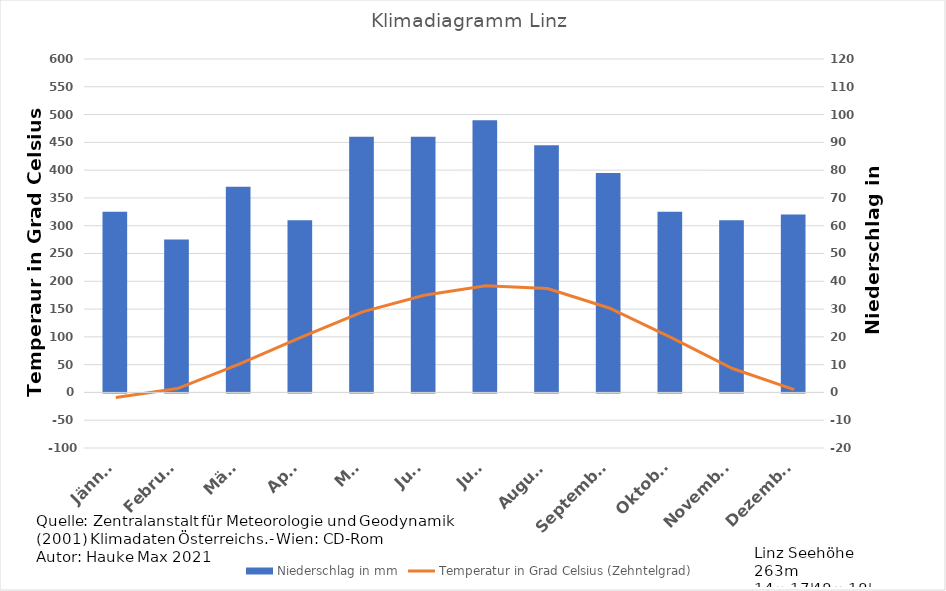
| Category | Niederschlag in mm |
|---|---|
| Jänner | 65 |
| Februar | 55 |
| März | 74 |
| April | 62 |
| Mai | 92 |
| Juni | 92 |
| Juli | 98 |
| August | 89 |
| September | 79 |
| Oktober | 65 |
| November | 62 |
| Dezember | 64 |